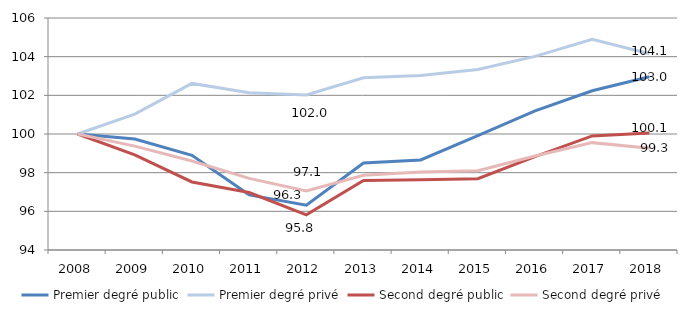
| Category | Premier degré public | Premier degré privé | Second degré public | Second degré privé |
|---|---|---|---|---|
| 2008.0 | 100 | 100 | 100 | 100 |
| 2009.0 | 99.744 | 101.026 | 98.925 | 99.375 |
| 2010.0 | 98.896 | 102.616 | 97.52 | 98.605 |
| 2011.0 | 96.852 | 102.138 | 96.972 | 97.703 |
| 2012.0 | 96.316 | 102.016 | 95.821 | 97.058 |
| 2013.0 | 98.502 | 102.907 | 97.6 | 97.865 |
| 2014.0 | 98.659 | 103.023 | 97.639 | 98.03 |
| 2015.0 | 99.919 | 103.34 | 97.691 | 98.101 |
| 2016.0 | 101.196 | 104.013 | 98.826 | 98.86 |
| 2017.0 | 102.239 | 104.898 | 99.9 | 99.553 |
| 2018.0 | 102.96 | 104.147 | 100.051 | 99.262 |